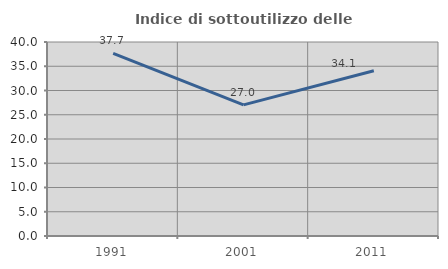
| Category | Indice di sottoutilizzo delle abitazioni  |
|---|---|
| 1991.0 | 37.668 |
| 2001.0 | 27.039 |
| 2011.0 | 34.082 |